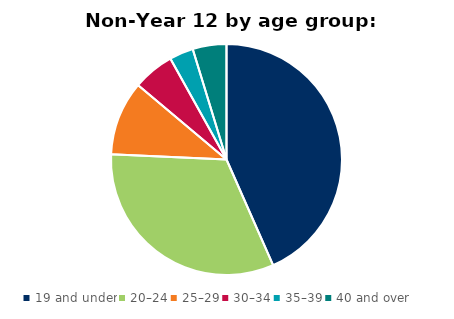
| Category | Series 0 |
|---|---|
| 19 and under | 6539 |
| 20–24 | 4874 |
| 25–29 | 1568 |
| 30–34 | 872 |
| 35–39 | 506 |
| 40 and over | 712 |